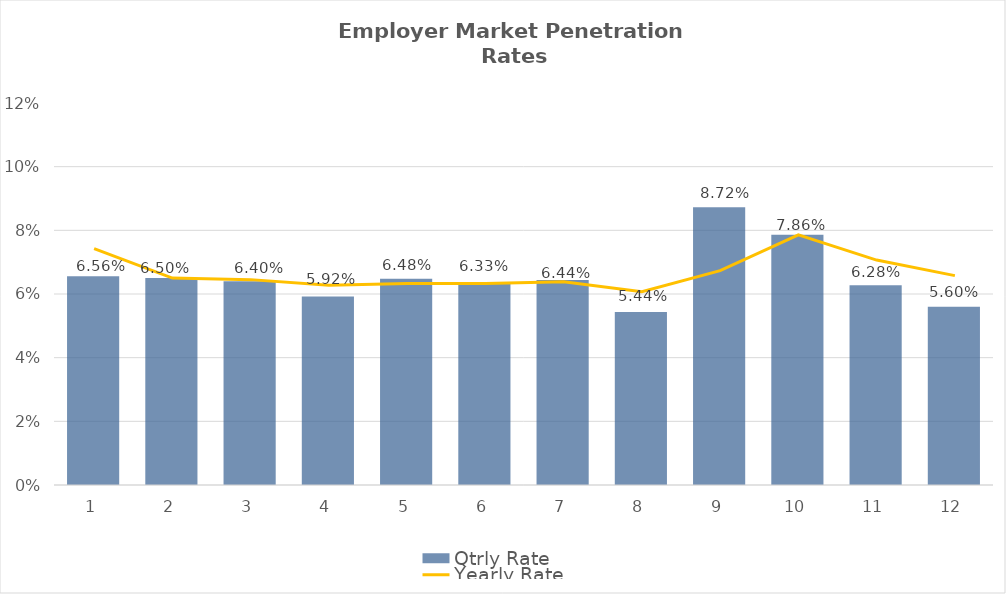
| Category | Qtrly Rate |
|---|---|
| 0 | 0.066 |
| 1 | 0.065 |
| 2 | 0.064 |
| 3 | 0.059 |
| 4 | 0.065 |
| 5 | 0.063 |
| 6 | 0.064 |
| 7 | 0.054 |
| 8 | 0.087 |
| 9 | 0.079 |
| 10 | 0.063 |
| 11 | 0.056 |